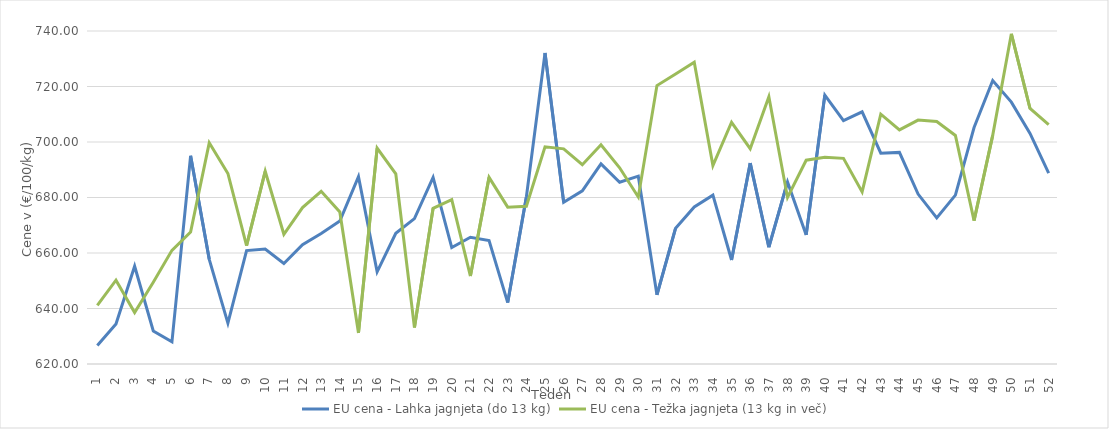
| Category | EU cena - Lahka jagnjeta (do 13 kg) | EU cena - Težka jagnjeta (13 kg in več) |
|---|---|---|
| 1.0 | 626.7 | 641.12 |
| 2.0 | 634.39 | 650.2 |
| 3.0 | 655.23 | 638.53 |
| 4.0 | 631.88 | 649.48 |
| 5.0 | 627.99 | 660.95 |
| 6.0 | 695.01 | 667.54 |
| 7.0 | 657.72 | 699.7 |
| 8.0 | 634.72 | 688.66 |
| 9.0 | 660.86 | 662.64 |
| 10.0 | 661.43 | 689.44 |
| 11.0 | 656.22 | 666.74 |
| 12.0 | 662.99 | 676.37 |
| 13.0 | 667.01 | 682.23 |
| 14.0 | 671.54 | 674.78 |
| 15.0 | 687.53 | 631.19 |
| 16.0 | 653.23 | 697.8 |
| 17.0 | 667.12 | 688.5 |
| 18.0 | 672.4 | 633.15 |
| 19.0 | 687.24 | 676.12 |
| 20.0 | 661.94 | 679.25 |
| 21.0 | 665.67 | 651.69 |
| 22.0 | 664.51 | 687.26 |
| 23.0 | 642.13 | 676.52 |
| 24.0 | 680.19 | 676.83 |
| 25.0 | 732.08 | 698.25 |
| 26.0 | 678.25 | 697.54 |
| 27.0 | 682.39 | 691.8 |
| 28.0 | 692.13 | 699 |
| 29.0 | 685.5 | 690.7 |
| 30.0 | 687.69 | 680.17 |
| 31.0 | 644.94 | 720.34 |
| 32.0 | 668.95 | 724.52 |
| 33.0 | 676.59 | 728.72 |
| 34.0 | 680.83 | 691.49 |
| 35.0 | 657.49 | 707.11 |
| 36.0 | 692.38 | 697.6 |
| 37.0 | 662.09 | 716.35 |
| 38.0 | 685.6 | 680.02 |
| 39.0 | 666.53 | 693.43 |
| 40.0 | 716.9 | 694.47 |
| 41.0 | 707.69 | 694.11 |
| 42.0 | 710.88 | 682 |
| 43.0 | 695.97 | 710.04 |
| 44.0 | 696.26 | 704.35 |
| 45.0 | 681.23 | 707.91 |
| 46.0 | 672.64 | 707.39 |
| 47.0 | 680.87 | 702.35 |
| 48.0 | 705.21 | 671.66 |
| 49.0 | 722.14 | 702.38 |
| 50.0 | 714.37 | 738.98 |
| 51.0 | 703.11 | 712.07 |
| 52.0 | 688.8 | 706.25 |